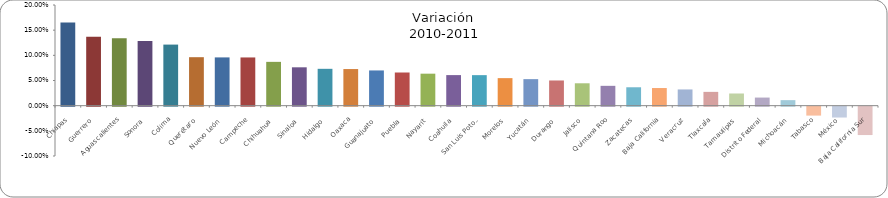
| Category | Variación
 2010-2011 |
|---|---|
| Chiapas | 0.165 |
| Guerrero | 0.137 |
| Aguascalientes | 0.134 |
| Sonora | 0.128 |
| Colima | 0.121 |
| Querétaro | 0.096 |
| Nuevo León | 0.096 |
| Campeche | 0.096 |
| Chihuahua | 0.087 |
| Sinaloa | 0.076 |
| Hidalgo | 0.073 |
| Oaxaca | 0.073 |
| Guanajuato | 0.07 |
| Puebla | 0.066 |
| Nayarit | 0.064 |
| Coahuila | 0.061 |
| San Luis Potosí | 0.061 |
| Morelos | 0.055 |
| Yucatán | 0.053 |
| Durango | 0.05 |
| Jalisco | 0.044 |
| Quintana Roo | 0.039 |
| Zacatecas | 0.037 |
| Baja California | 0.035 |
| Veracruz | 0.032 |
| Tlaxcala | 0.027 |
| Tamaulipas | 0.024 |
| Distrito Federal | 0.016 |
| Michoacán | 0.011 |
| Tabasco | -0.018 |
| México | -0.022 |
| Baja California Sur | -0.056 |